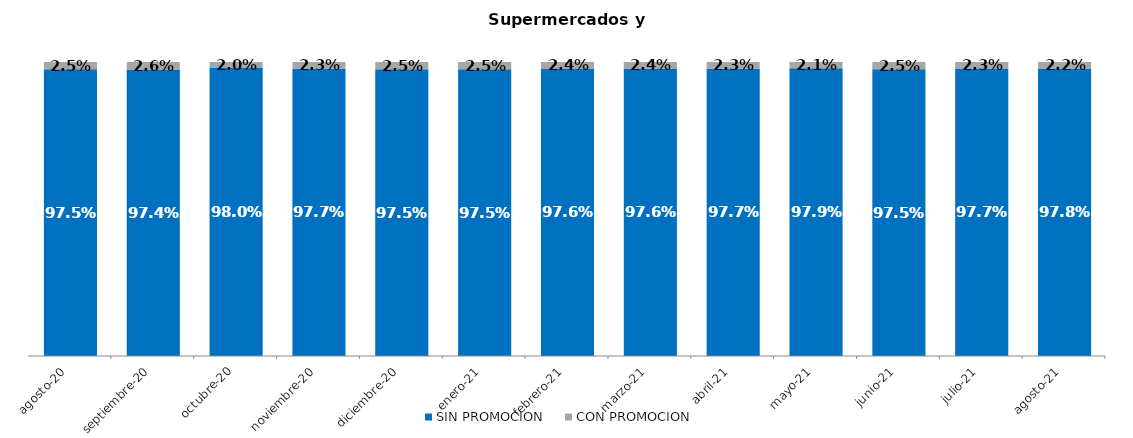
| Category | SIN PROMOCION   | CON PROMOCION   |
|---|---|---|
| 2020-08-01 | 0.975 | 0.025 |
| 2020-09-01 | 0.974 | 0.026 |
| 2020-10-01 | 0.98 | 0.02 |
| 2020-11-01 | 0.977 | 0.023 |
| 2020-12-01 | 0.975 | 0.025 |
| 2021-01-01 | 0.975 | 0.025 |
| 2021-02-01 | 0.976 | 0.024 |
| 2021-03-01 | 0.976 | 0.024 |
| 2021-04-01 | 0.977 | 0.023 |
| 2021-05-01 | 0.979 | 0.021 |
| 2021-06-01 | 0.975 | 0.025 |
| 2021-07-01 | 0.977 | 0.023 |
| 2021-08-01 | 0.978 | 0.022 |